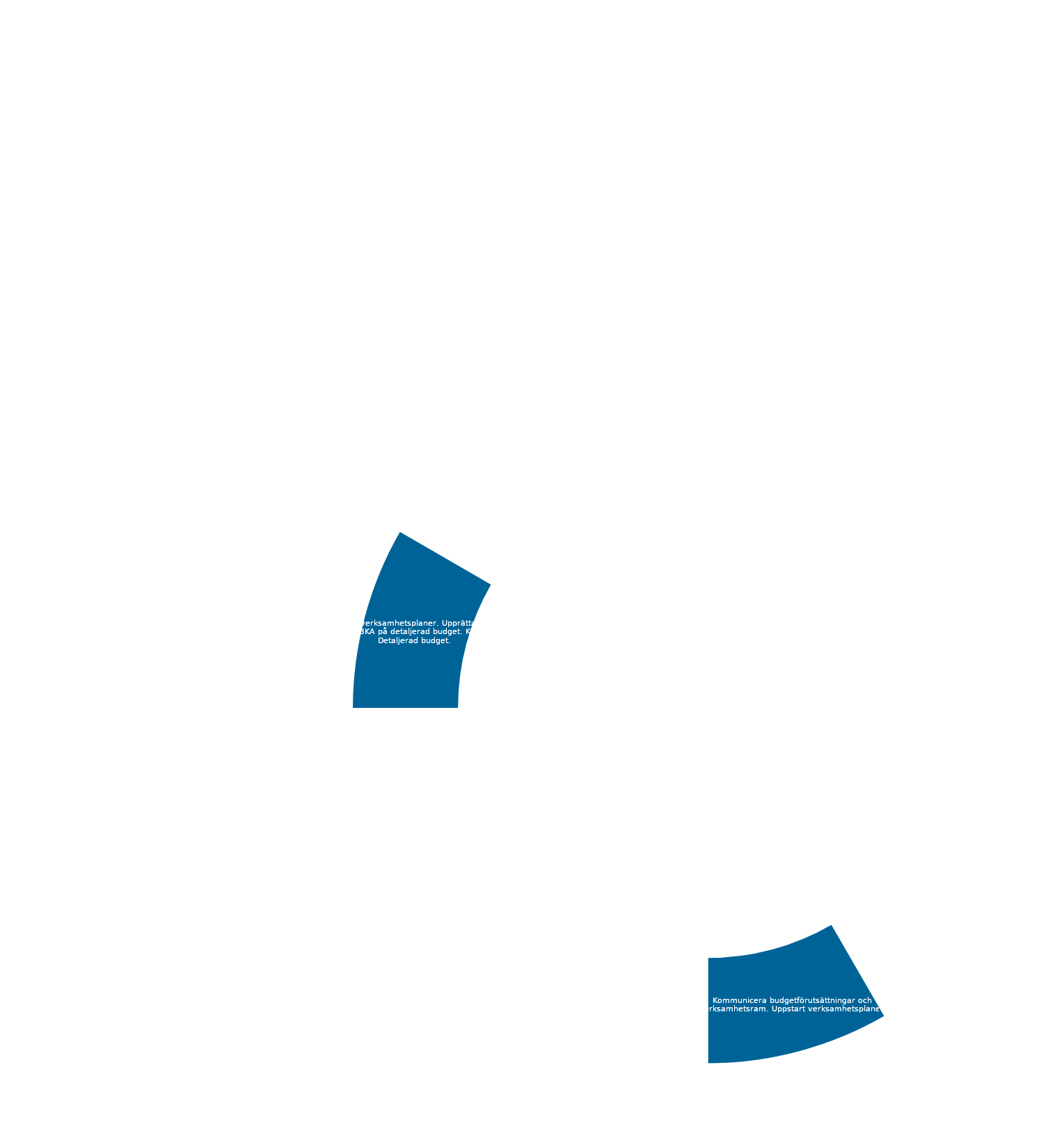
| Category | 1 |
|---|---|
|  | 1 |
|  | 1 |
|  | 1 |
|  | 1 |
|  | 1 |
| Kommunicera budgetförutsättningar och verksamhetsram. Uppstart verksamhetsplaner.  | 1 |
|  | 1 |
|  | 1 |
|  | 1 |
| Inlämning verksamhetsplaner. Upprätta detaljerad budget. BKA på detaljerad budget. Kyrkorådet: Detaljerad budget.  | 1 |